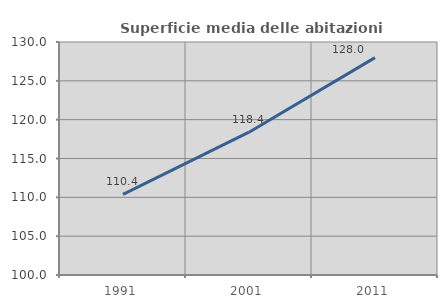
| Category | Superficie media delle abitazioni occupate |
|---|---|
| 1991.0 | 110.384 |
| 2001.0 | 118.384 |
| 2011.0 | 127.987 |